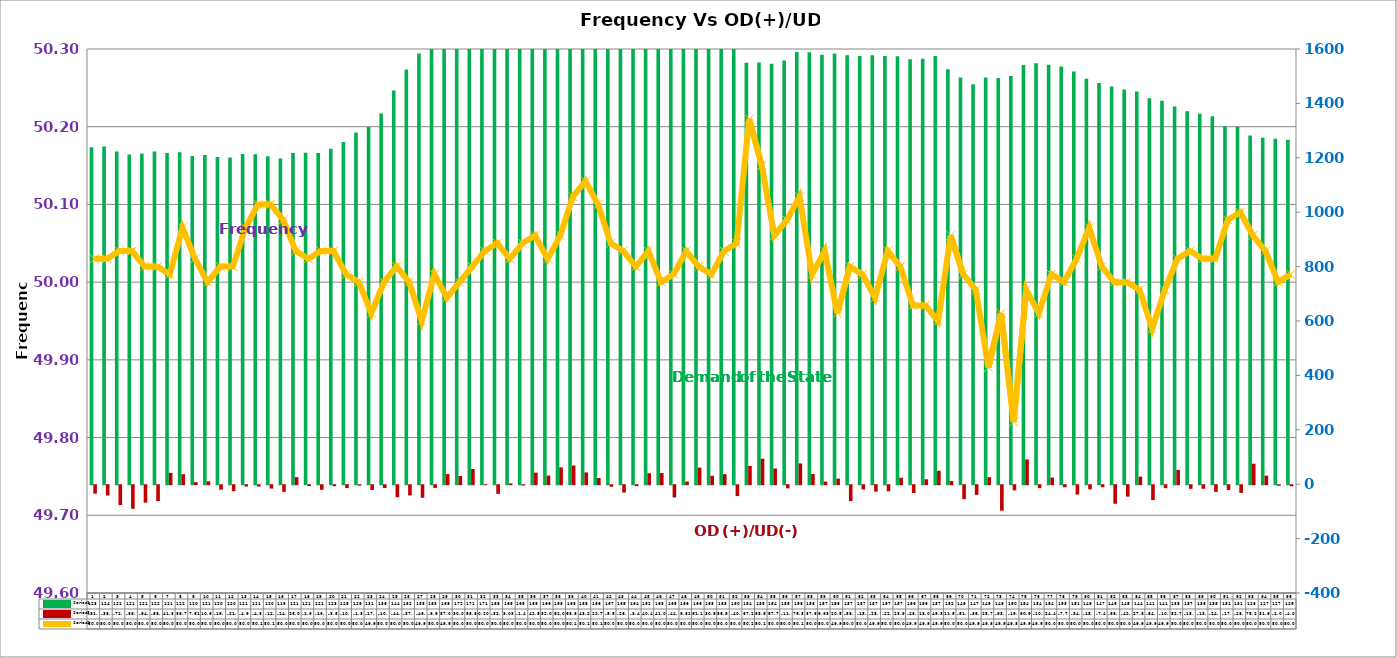
| Category | Series 2 | Series 4 |
|---|---|---|
| 0 | 1239 | -31.035 |
| 1 | 1242 | -38.037 |
| 2 | 1223 | -72.788 |
| 3 | 1212 | -86.791 |
| 4 | 1216 | -64.046 |
| 5 | 1223 | -58.417 |
| 6 | 1218 | 41.878 |
| 7 | 1220 | 36.712 |
| 8 | 1207 | 7.605 |
| 9 | 1210 | 10.676 |
| 10 | 1203 | -16.522 |
| 11 | 1201 | -21.927 |
| 12 | 1214 | -4.959 |
| 13 | 1213 | -4.798 |
| 14 | 1206 | -12.346 |
| 15 | 1197 | -24.348 |
| 16 | 1218 | 26.052 |
| 17 | 1219 | -2.95 |
| 18 | 1218 | -16.83 |
| 19 | 1233 | -3.517 |
| 20 | 1258 | -10.609 |
| 21 | 1293 | -1.801 |
| 22 | 1313 | -17.463 |
| 23 | 1363 | -10.333 |
| 24 | 1447 | -44.375 |
| 25 | 1525 | -37.797 |
| 26 | 1583 | -46.185 |
| 27 | 1638 | -9.952 |
| 28 | 1688 | 37.043 |
| 29 | 1721 | 30.031 |
| 30 | 1716 | 55.814 |
| 31 | 1711 | 0.201 |
| 32 | 1686 | -32.052 |
| 33 | 1658 | 3.03 |
| 34 | 1659 | -1.457 |
| 35 | 1660 | 42.556 |
| 36 | 1662 | 32.068 |
| 37 | 1683 | 62.035 |
| 38 | 1689 | 68.825 |
| 39 | 1683 | 43.275 |
| 40 | 1666 | 22.712 |
| 41 | 1679 | -5.814 |
| 42 | 1651 | -26.843 |
| 43 | 1648 | -3.456 |
| 44 | 1624 | 40.466 |
| 45 | 1636 | 41.006 |
| 46 | 1655 | -44.957 |
| 47 | 1666 | 9.823 |
| 48 | 1661 | 61.152 |
| 49 | 1632 | 30.984 |
| 50 | 1635 | 36.944 |
| 51 | 1600 | -40.036 |
| 52 | 1549 | 67.249 |
| 53 | 1550 | 93.599 |
| 54 | 1546 | 57.78 |
| 55 | 1558 | -11.739 |
| 56 | 1589 | 76.348 |
| 57 | 1588 | 37.601 |
| 58 | 1579 | 9.632 |
| 59 | 1583 | 20.541 |
| 60 | 1577 | -58.556 |
| 61 | 1574 | -15.662 |
| 62 | 1577 | -23.719 |
| 63 | 1574 | -22.525 |
| 64 | 1573 | 23.933 |
| 65 | 1562 | -28.694 |
| 66 | 1564 | 18.076 |
| 67 | 1574 | 49.378 |
| 68 | 1526 | 11.561 |
| 69 | 1495 | -51.405 |
| 70 | 1470 | -35.488 |
| 71 | 1495 | 25.793 |
| 72 | 1493 | -93.614 |
| 73 | 1501 | -19.049 |
| 74 | 1541 | 90.991 |
| 75 | 1548 | -10.921 |
| 76 | 1542 | 24.414 |
| 77 | 1536 | -7.738 |
| 78 | 1517 | -34.271 |
| 79 | 1491 | -15.271 |
| 80 | 1475 | -7.447 |
| 81 | 1462 | -68.224 |
| 82 | 1451 | -42.059 |
| 83 | 1444 | 27.816 |
| 84 | 1419 | -54.814 |
| 85 | 1410 | -10.865 |
| 86 | 1389 | 52.736 |
| 87 | 1371 | -13.264 |
| 88 | 1362 | -13.154 |
| 89 | 1353 | -24.554 |
| 90 | 1316 | -17.347 |
| 91 | 1314 | -28.232 |
| 92 | 1282 | 75.21 |
| 93 | 1274 | 31.602 |
| 94 | 1270 | -2.05 |
| 95 | 1266 | -4.061 |